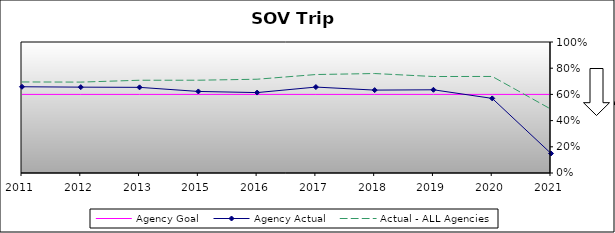
| Category | Agency Goal | Agency Actual | Actual - ALL Agencies |
|---|---|---|---|
| 2011.0 | 0.6 | 0.658 | 0.695 |
| 2012.0 | 0.6 | 0.655 | 0.694 |
| 2013.0 | 0.6 | 0.654 | 0.708 |
| 2015.0 | 0.6 | 0.623 | 0.708 |
| 2016.0 | 0.6 | 0.614 | 0.716 |
| 2017.0 | 0.6 | 0.656 | 0.752 |
| 2018.0 | 0.6 | 0.633 | 0.759 |
| 2019.0 | 0.6 | 0.635 | 0.736 |
| 2020.0 | 0.6 | 0.57 | 0.737 |
| 2021.0 | 0.6 | 0.149 | 0.487 |